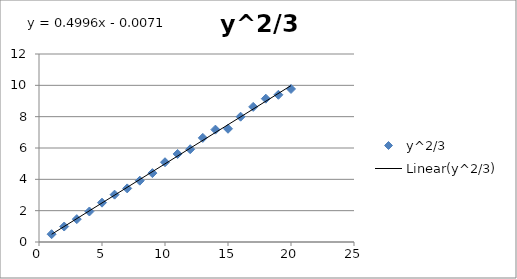
| Category | y^2/3 |
|---|---|
| 1.0 | 0.498 |
| 2.0 | 0.988 |
| 3.0 | 1.458 |
| 4.0 | 1.947 |
| 5.0 | 2.512 |
| 6.0 | 3.023 |
| 7.0 | 3.422 |
| 8.0 | 3.914 |
| 9.0 | 4.396 |
| 10.0 | 5.091 |
| 11.0 | 5.622 |
| 12.0 | 5.923 |
| 13.0 | 6.646 |
| 14.0 | 7.172 |
| 15.0 | 7.228 |
| 16.0 | 7.999 |
| 17.0 | 8.626 |
| 18.0 | 9.148 |
| 19.0 | 9.397 |
| 20.0 | 9.768 |